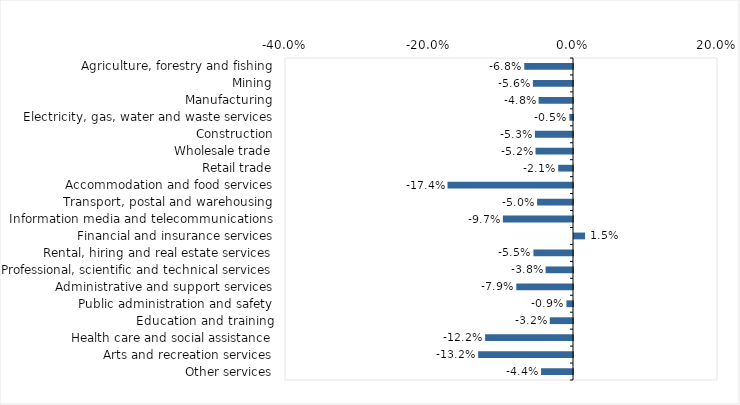
| Category | This week |
|---|---|
| Agriculture, forestry and fishing | -0.068 |
| Mining | -0.056 |
| Manufacturing | -0.048 |
| Electricity, gas, water and waste services | -0.005 |
| Construction | -0.053 |
| Wholesale trade | -0.052 |
| Retail trade | -0.021 |
| Accommodation and food services | -0.174 |
| Transport, postal and warehousing | -0.05 |
| Information media and telecommunications | -0.097 |
| Financial and insurance services | 0.015 |
| Rental, hiring and real estate services | -0.055 |
| Professional, scientific and technical services | -0.038 |
| Administrative and support services | -0.079 |
| Public administration and safety | -0.009 |
| Education and training | -0.032 |
| Health care and social assistance | -0.122 |
| Arts and recreation services | -0.132 |
| Other services | -0.044 |